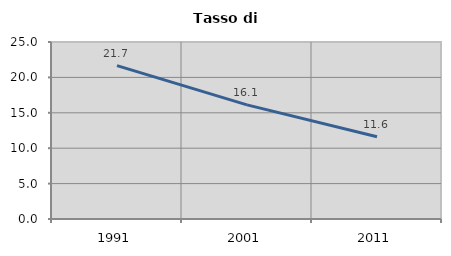
| Category | Tasso di disoccupazione   |
|---|---|
| 1991.0 | 21.672 |
| 2001.0 | 16.124 |
| 2011.0 | 11.611 |